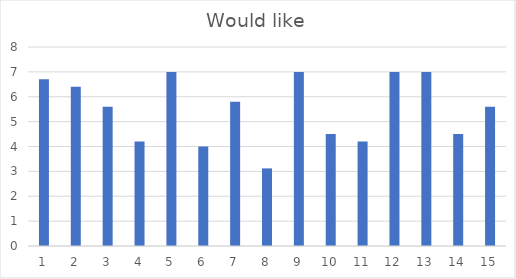
| Category | Would like |
|---|---|
| 0 | 6.7 |
| 1 | 6.4 |
| 2 | 5.6 |
| 3 | 4.2 |
| 4 | 7 |
| 5 | 4 |
| 6 | 5.8 |
| 7 | 3.12 |
| 8 | 7 |
| 9 | 4.5 |
| 10 | 4.2 |
| 11 | 7 |
| 12 | 7 |
| 13 | 4.5 |
| 14 | 5.6 |